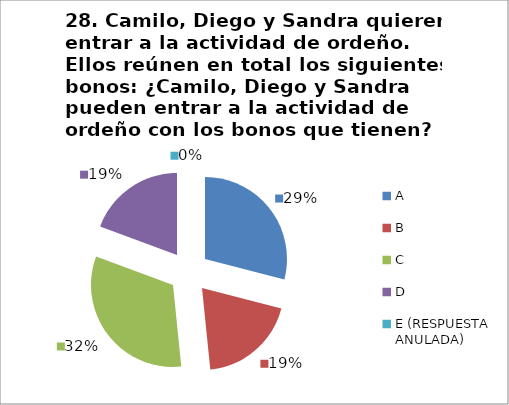
| Category | CANTIDAD DE RESPUESTAS PREGUNTA (28) | PORCENTAJE |
|---|---|---|
| A | 9 | 0.29 |
| B | 6 | 0.194 |
| C | 10 | 0.323 |
| D | 6 | 0.194 |
| E (RESPUESTA ANULADA) | 0 | 0 |